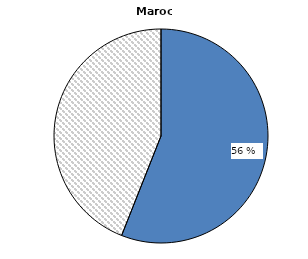
| Category | Maroc |
|---|---|
|   Sans contrat de travail formel | 56 |
| Avec un contrat de travail formel | 44 |